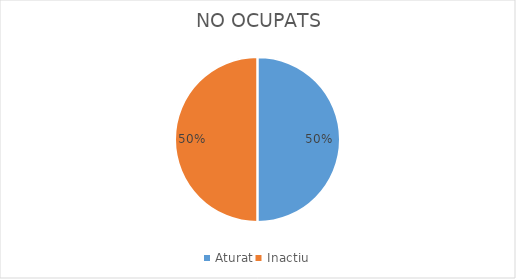
| Category | Series 0 |
|---|---|
| Aturat | 6 |
| Inactiu | 6 |